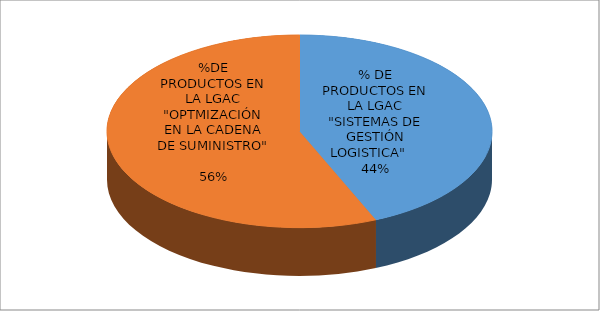
| Category | Series 0 |
|---|---|
| % DE PRODUCTOS EN LA LGAC "SISTEMAS DE GESTIÓN LOGISTICA"    | 0.435 |
| %DE PRODUCTOS EN LA LGAC "OPTMIZACIÓN EN LA CADENA DE SUMINISTRO"    | 0.565 |